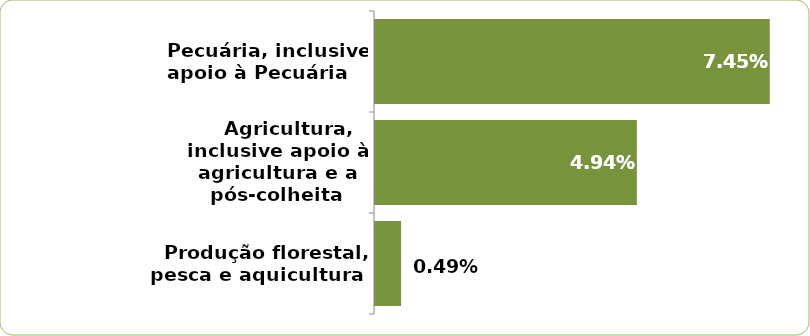
| Category | Series 0 |
|---|---|
|    Produção florestal, pesca e aquicultura | 0.005 |
|    Agricultura, inclusive apoio à agricultura e a pós-colheita | 0.049 |
|    Pecuária, inclusive apoio à Pecuária | 0.074 |